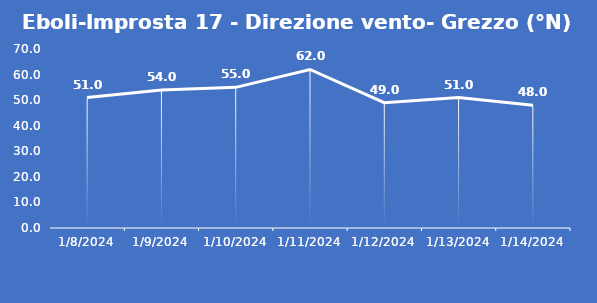
| Category | Eboli-Improsta 17 - Direzione vento- Grezzo (°N) |
|---|---|
| 1/8/24 | 51 |
| 1/9/24 | 54 |
| 1/10/24 | 55 |
| 1/11/24 | 62 |
| 1/12/24 | 49 |
| 1/13/24 | 51 |
| 1/14/24 | 48 |